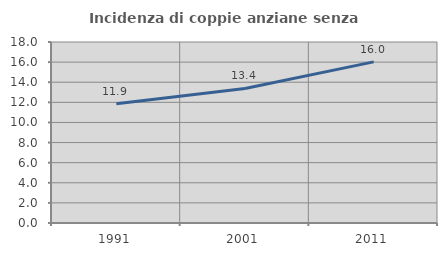
| Category | Incidenza di coppie anziane senza figli  |
|---|---|
| 1991.0 | 11.856 |
| 2001.0 | 13.382 |
| 2011.0 | 16.026 |